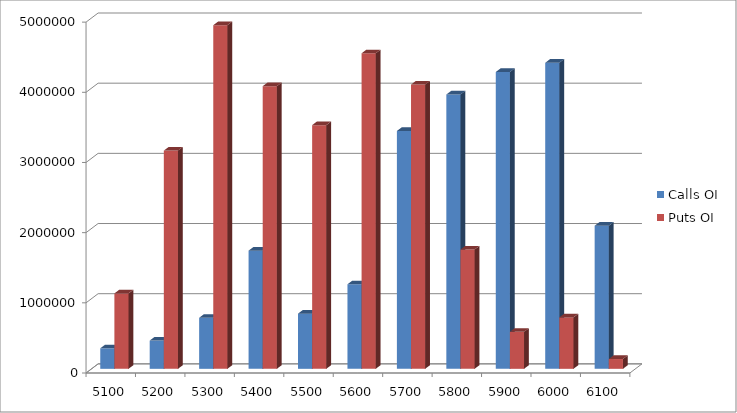
| Category | Calls OI | Puts OI |
|---|---|---|
| 5100.0 | 292450 | 1075000 |
| 5200.0 | 402950 | 3109800 |
| 5300.0 | 727150 | 4897100 |
| 5400.0 | 1684300 | 4027900 |
| 5500.0 | 786300 | 3472900 |
| 5600.0 | 1204650 | 4496600 |
| 5700.0 | 3389550 | 4050450 |
| 5800.0 | 3909100 | 1699250 |
| 5900.0 | 4229950 | 526850 |
| 6000.0 | 4361600 | 733200 |
| 6100.0 | 2039400 | 139650 |